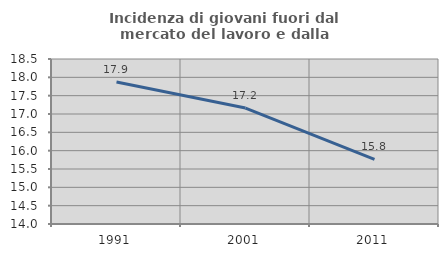
| Category | Incidenza di giovani fuori dal mercato del lavoro e dalla formazione  |
|---|---|
| 1991.0 | 17.874 |
| 2001.0 | 17.162 |
| 2011.0 | 15.762 |